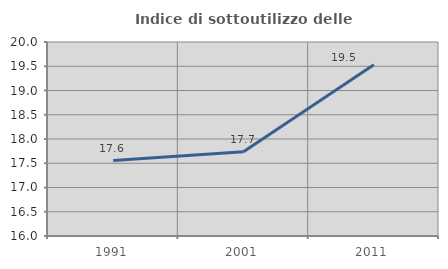
| Category | Indice di sottoutilizzo delle abitazioni  |
|---|---|
| 1991.0 | 17.555 |
| 2001.0 | 17.738 |
| 2011.0 | 19.529 |